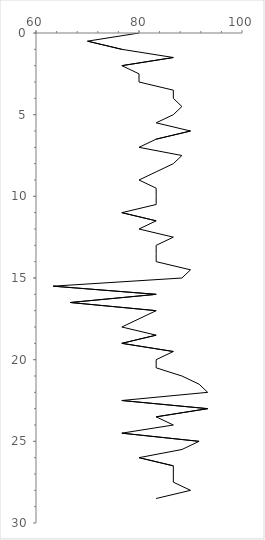
| Category | Series 0 |
|---|---|
| 80.0 | 0 |
| 70.0 | 0.5 |
| 76.66666666666667 | 1 |
| 86.66666666666667 | 1.5 |
| 76.66666666666667 | 2 |
| 80.0 | 2.5 |
| 80.0 | 3 |
| 86.66666666666667 | 3.5 |
| 86.66666666666667 | 4 |
| 88.33333333333333 | 4.5 |
| 86.66666666666667 | 5 |
| 83.33333333333334 | 5.5 |
| 90.0 | 6 |
| 83.33333333333334 | 6.5 |
| 80.0 | 7 |
| 88.33333333333333 | 7.5 |
| 86.66666666666667 | 8 |
| 83.33333333333334 | 8.5 |
| 80.0 | 9 |
| 83.33333333333334 | 9.5 |
| 83.33333333333334 | 10 |
| 83.33333333333334 | 10.5 |
| 76.66666666666667 | 11 |
| 83.33333333333334 | 11.5 |
| 80.0 | 12 |
| 86.66666666666667 | 12.5 |
| 83.33333333333334 | 13 |
| 83.33333333333334 | 13.5 |
| 83.33333333333334 | 14 |
| 90.0 | 14.5 |
| 88.33333333333333 | 15 |
| 63.33333333333333 | 15.5 |
| 83.33333333333334 | 16 |
| 66.66666666666667 | 16.5 |
| 83.33333333333334 | 17 |
| 80.0 | 17.5 |
| 76.66666666666667 | 18 |
| 83.33333333333334 | 18.5 |
| 76.66666666666667 | 19 |
| 86.66666666666667 | 19.5 |
| 83.33333333333334 | 20 |
| 83.33333333333334 | 20.5 |
| 88.33333333333333 | 21 |
| 91.66666666666667 | 21.5 |
| 93.33333333333333 | 22 |
| 76.66666666666667 | 22.5 |
| 93.33333333333333 | 23 |
| 83.33333333333334 | 23.5 |
| 86.66666666666667 | 24 |
| 76.66666666666667 | 24.5 |
| 91.66666666666667 | 25 |
| 88.33333333333333 | 25.5 |
| 80.0 | 26 |
| 86.66666666666667 | 26.5 |
| 86.66666666666667 | 27 |
| 86.66666666666667 | 27.5 |
| 90.0 | 28 |
| 83.33333333333334 | 28.5 |